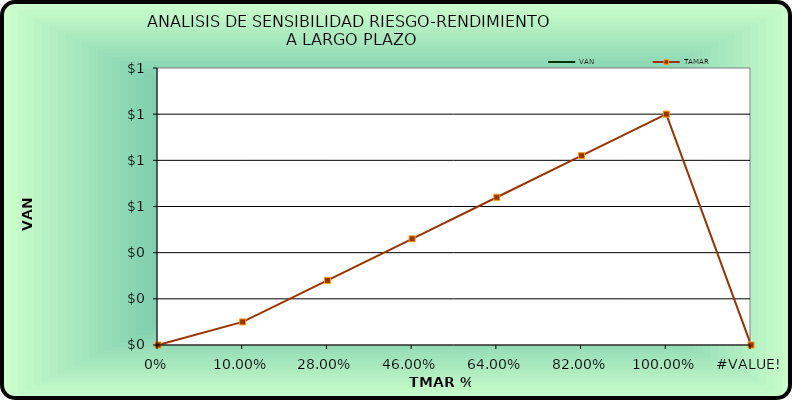
| Category | VAN | TAMAR |
|---|---|---|
| 0.0 | 0 | 0 |
| 0.1 | 0 | 0.1 |
| 0.28 | 0 | 0.28 |
| 0.46 | 0 | 0.46 |
| 0.64 | 0 | 0.64 |
| 0.8200000000000001 | 0 | 0.82 |
| 1.0 | 0 | 1 |
| 0.0 | 0 | 0 |